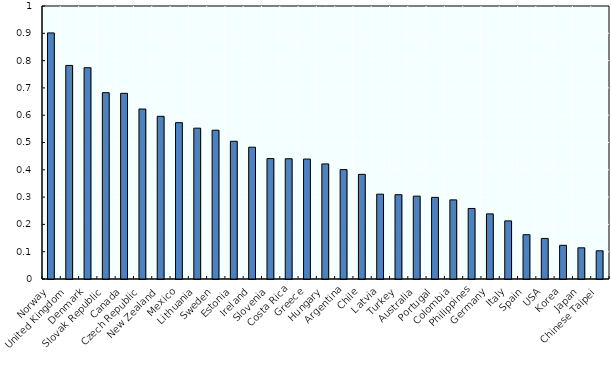
| Category | Index of diversity of aquaculture production |
|---|---|
| Norway | 0.901 |
| United Kingdom | 0.782 |
| Denmark | 0.774 |
| Slovak Republic | 0.682 |
| Canada | 0.68 |
| Czech Republic | 0.623 |
| New Zealand | 0.596 |
| Mexico | 0.573 |
| Lithuania | 0.553 |
| Sweden | 0.545 |
| Estonia | 0.505 |
| Ireland | 0.483 |
| Slovenia | 0.441 |
| Costa Rica | 0.44 |
| Greece | 0.439 |
| Hungary | 0.422 |
| Argentina | 0.401 |
| Chile | 0.383 |
| Latvia | 0.311 |
| Turkey | 0.309 |
| Australia | 0.304 |
| Portugal | 0.299 |
| Colombia | 0.29 |
| Philippines | 0.258 |
| Germany | 0.239 |
| Italy | 0.213 |
| Spain | 0.162 |
| USA | 0.149 |
| Korea | 0.123 |
| Japan | 0.114 |
| Chinese Taipei | 0.103 |